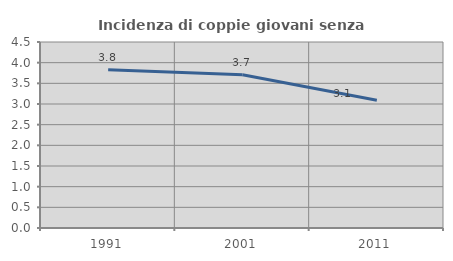
| Category | Incidenza di coppie giovani senza figli |
|---|---|
| 1991.0 | 3.827 |
| 2001.0 | 3.707 |
| 2011.0 | 3.093 |